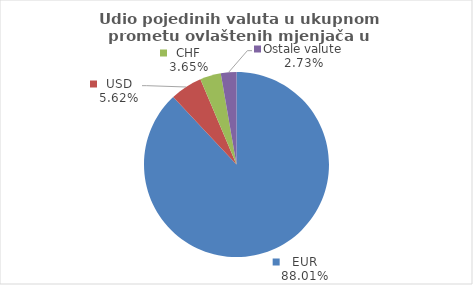
| Category | Series 0 |
|---|---|
| EUR | 88.005 |
| USD | 5.616 |
| CHF | 3.651 |
| Ostale valute | 2.727 |